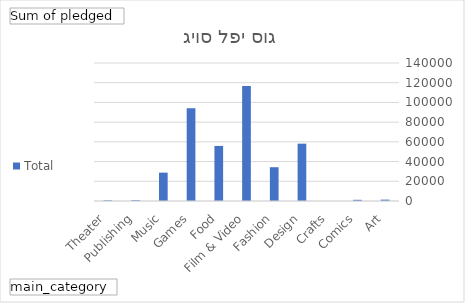
| Category | Total |
|---|---|
| Art | 1395 |
| Comics | 1209.04 |
| Crafts | 0 |
| Design | 58163 |
| Fashion | 34269 |
| Film & Video | 116646.88 |
| Food | 55883 |
| Games | 94175 |
| Music | 28778 |
| Publishing | 789 |
| Theater | 650 |